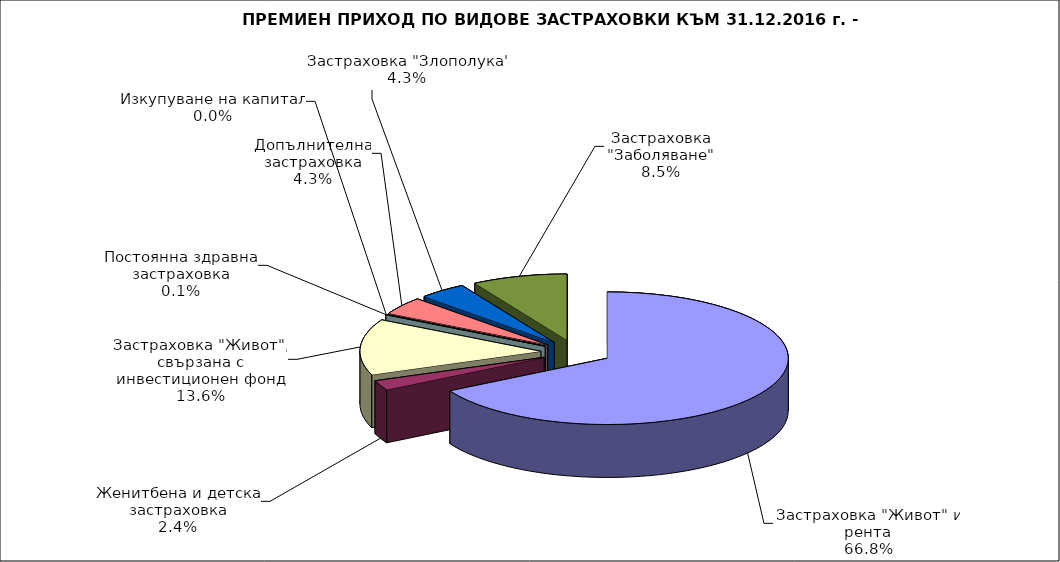
| Category | Series 0 |
|---|---|
| Застраховка "Живот" и рента | 0.668 |
| Женитбена и детска застраховка | 0.024 |
| Застраховка "Живот", свързана с инвестиционен фонд | 0.136 |
| Постоянна здравна застраховка | 0.001 |
| Изкупуване на капитал | 0 |
| Допълнителна застраховка | 0.043 |
| Застраховка "Злополука" | 0.043 |
| Застраховка "Заболяване" | 0.085 |